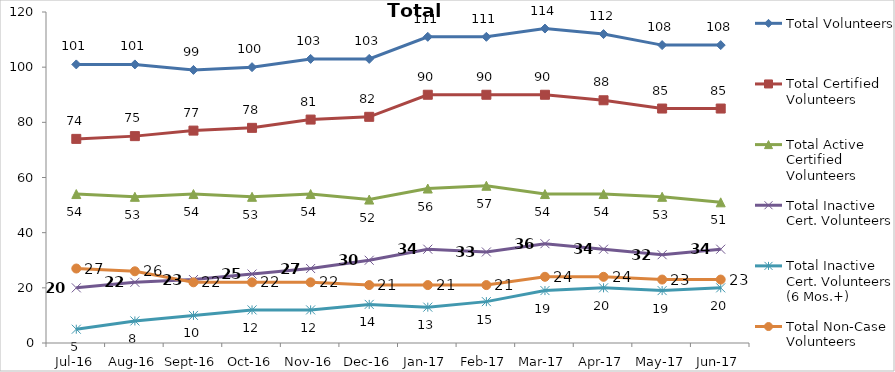
| Category | Total Volunteers | Total Certified Volunteers | Total Active Certified Volunteers | Total Inactive Cert. Volunteers | Total Inactive Cert. Volunteers (6 Mos.+) | Total Non-Case Volunteers |
|---|---|---|---|---|---|---|
| Jul-16 | 101 | 74 | 54 | 20 | 5 | 27 |
| Aug-16 | 101 | 75 | 53 | 22 | 8 | 26 |
| Sep-16 | 99 | 77 | 54 | 23 | 10 | 22 |
| Oct-16 | 100 | 78 | 53 | 25 | 12 | 22 |
| Nov-16 | 103 | 81 | 54 | 27 | 12 | 22 |
| Dec-16 | 103 | 82 | 52 | 30 | 14 | 21 |
| Jan-17 | 111 | 90 | 56 | 34 | 13 | 21 |
| Feb-17 | 111 | 90 | 57 | 33 | 15 | 21 |
| Mar-17 | 114 | 90 | 54 | 36 | 19 | 24 |
| Apr-17 | 112 | 88 | 54 | 34 | 20 | 24 |
| May-17 | 108 | 85 | 53 | 32 | 19 | 23 |
| Jun-17 | 108 | 85 | 51 | 34 | 20 | 23 |